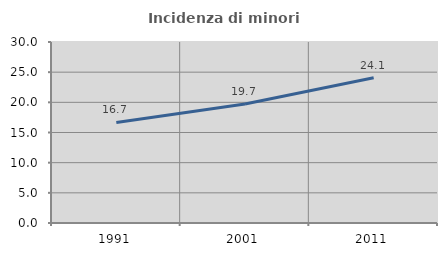
| Category | Incidenza di minori stranieri |
|---|---|
| 1991.0 | 16.667 |
| 2001.0 | 19.725 |
| 2011.0 | 24.068 |